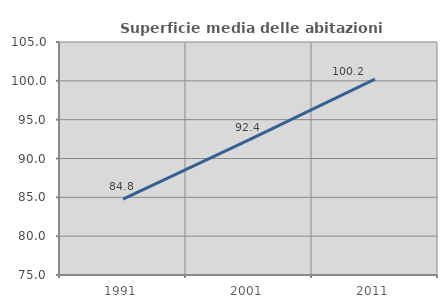
| Category | Superficie media delle abitazioni occupate |
|---|---|
| 1991.0 | 84.76 |
| 2001.0 | 92.409 |
| 2011.0 | 100.219 |